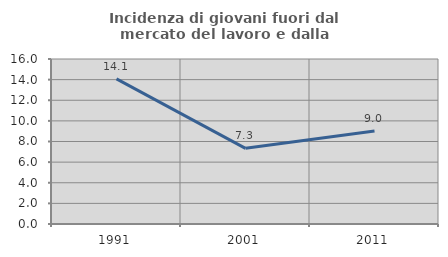
| Category | Incidenza di giovani fuori dal mercato del lavoro e dalla formazione  |
|---|---|
| 1991.0 | 14.07 |
| 2001.0 | 7.339 |
| 2011.0 | 9.028 |